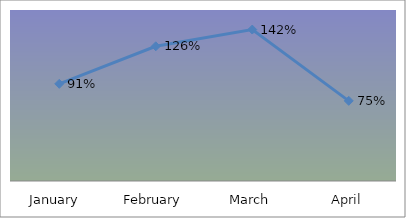
| Category | PERCENTAGE |
|---|---|
| January  | 0.909 |
| February | 1.26 |
| March | 1.417 |
| April | 0.75 |